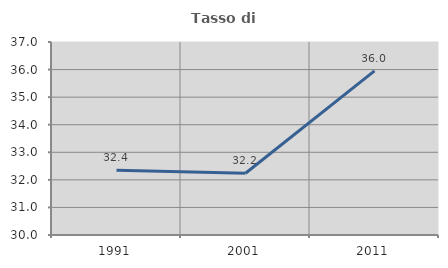
| Category | Tasso di occupazione   |
|---|---|
| 1991.0 | 32.353 |
| 2001.0 | 32.241 |
| 2011.0 | 35.955 |